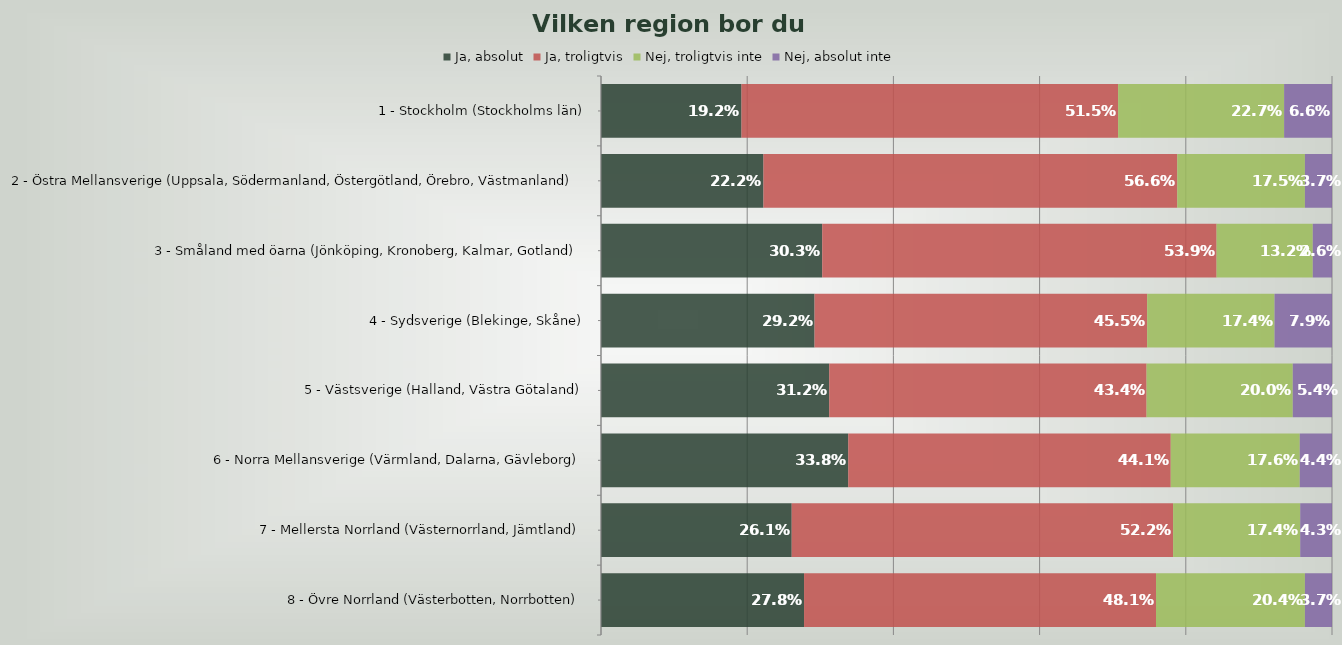
| Category | Ja, absolut | Ja, troligtvis | Nej, troligtvis inte | Nej, absolut inte |
|---|---|---|---|---|
| 1 - Stockholm (Stockholms län) | 0.192 | 0.515 | 0.227 | 0.066 |
| 2 - Östra Mellansverige (Uppsala, Södermanland, Östergötland, Örebro, Västmanland) | 0.222 | 0.566 | 0.175 | 0.037 |
| 3 - Småland med öarna (Jönköping, Kronoberg, Kalmar, Gotland) | 0.303 | 0.539 | 0.132 | 0.026 |
| 4 - Sydsverige (Blekinge, Skåne) | 0.292 | 0.455 | 0.174 | 0.079 |
| 5 - Västsverige (Halland, Västra Götaland) | 0.312 | 0.434 | 0.2 | 0.054 |
| 6 - Norra Mellansverige (Värmland, Dalarna, Gävleborg) | 0.338 | 0.441 | 0.176 | 0.044 |
| 7 - Mellersta Norrland (Västernorrland, Jämtland) | 0.261 | 0.522 | 0.174 | 0.043 |
| 8 - Övre Norrland (Västerbotten, Norrbotten) | 0.278 | 0.481 | 0.204 | 0.037 |